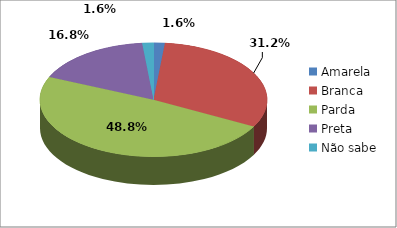
| Category | Series 0 |
|---|---|
| Amarela | 2 |
| Branca | 39 |
| Parda | 61 |
| Preta | 21 |
| Não sabe | 2 |